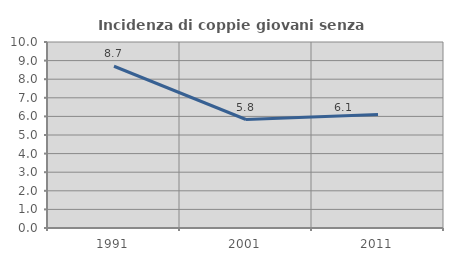
| Category | Incidenza di coppie giovani senza figli |
|---|---|
| 1991.0 | 8.696 |
| 2001.0 | 5.833 |
| 2011.0 | 6.107 |